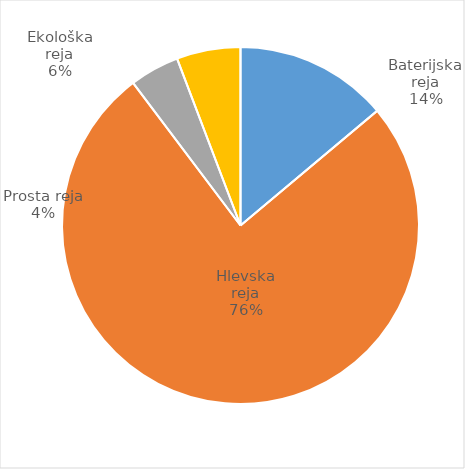
| Category | Število kosov jajc |
|---|---|
| Baterijska reja | 299196 |
| Hlevska reja | 1633520 |
| Prosta reja | 96918 |
| Ekološka reja | 124560 |